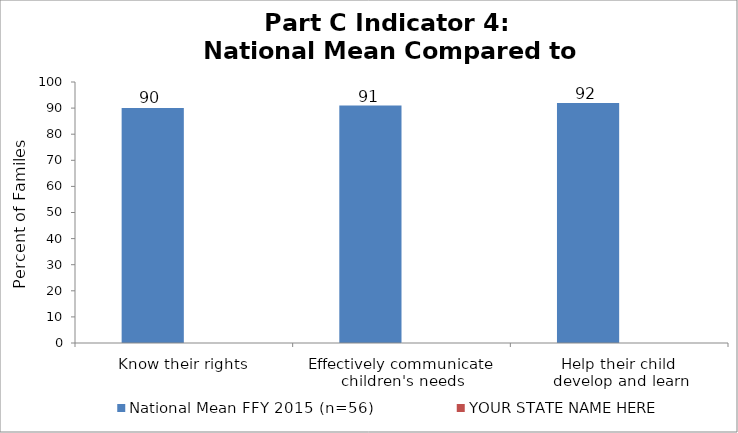
| Category | National Mean FFY 2015 (n=56) | YOUR STATE NAME HERE |
|---|---|---|
| Know their rights | 90 |  |
| Effectively communicate 
children's needs | 91 |  |
| Help their child 
develop and learn | 92 |  |